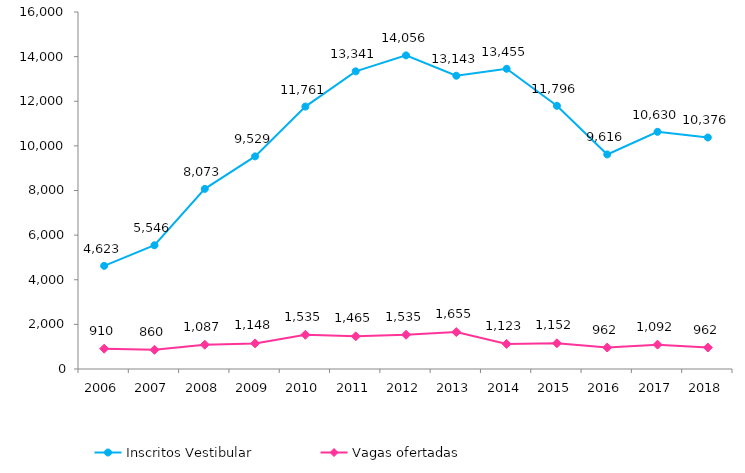
| Category | Inscritos Vestibular |
|---|---|
| 2006.0 | 4623 |
| 2007.0 | 5546 |
| 2008.0 | 8073 |
| 2009.0 | 9529 |
| 2010.0 | 11761 |
| 2011.0 | 13341 |
| 2012.0 | 14056 |
| 2013.0 | 13143 |
| 2014.0 | 13455 |
| 2015.0 | 11796 |
| 2016.0 | 9616 |
| 2017.0 | 10630 |
| 2018.0 | 10376 |